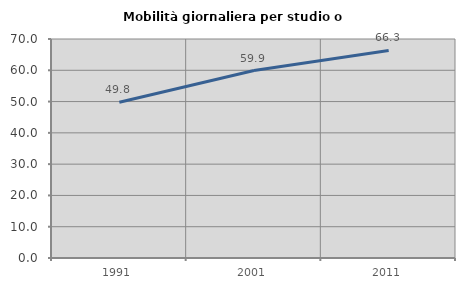
| Category | Mobilità giornaliera per studio o lavoro |
|---|---|
| 1991.0 | 49.797 |
| 2001.0 | 59.904 |
| 2011.0 | 66.337 |